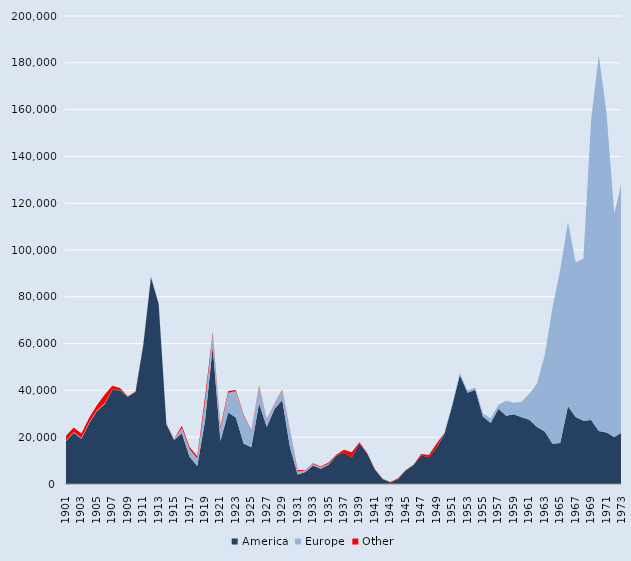
| Category | America | Europe | Other |
|---|---|---|---|
| 1901.0 | 18426 | 207 | 2013 |
| 1902.0 | 21916 | 290 | 1964 |
| 1903.0 | 19339 | 320 | 1952 |
| 1904.0 | 25963 | 379 | 1962 |
| 1905.0 | 31227 | 292 | 2091 |
| 1906.0 | 34094 | 369 | 3630 |
| 1907.0 | 40152 | 106 | 1692 |
| 1908.0 | 40046 | 83 | 866 |
| 1909.0 | 37295 | 67 | 89 |
| 1910.0 | 39359 | 48 | 268 |
| 1911.0 | 59150 | 253 | 146 |
| 1912.0 | 88383 | 329 | 122 |
| 1913.0 | 77015 | 407 | 3 |
| 1914.0 | 25576 | 114 | 40 |
| 1915.0 | 18830 | 390 | 94 |
| 1916.0 | 21662 | 2292 | 943 |
| 1917.0 | 11593 | 3381 | 851 |
| 1918.0 | 7663 | 3219 | 971 |
| 1919.0 | 26883 | 7989 | 2266 |
| 1920.0 | 58618 | 5008 | 1157 |
| 1921.0 | 18387 | 5167 | 1043 |
| 1922.0 | 30536 | 8488 | 771 |
| 1923.0 | 28395 | 11195 | 581 |
| 1924.0 | 17294 | 12003 | 413 |
| 1925.0 | 15697 | 6818 | 369 |
| 1926.0 | 34538 | 7087 | 442 |
| 1927.0 | 24375 | 3073 | 226 |
| 1928.0 | 32084 | 2013 | 200 |
| 1929.0 | 35898 | 4122 | 341 |
| 1930.0 | 15805 | 7014 | 377 |
| 1931.0 | 4055 | 1328 | 650 |
| 1932.0 | 5151 | 557 | 201 |
| 1933.0 | 7872 | 720 | 313 |
| 1934.0 | 6491 | 623 | 358 |
| 1935.0 | 8228 | 434 | 478 |
| 1936.0 | 12024 | 0 | 460 |
| 1937.0 | 13505 | 0 | 1162 |
| 1938.0 | 11290 | 0 | 2319 |
| 1939.0 | 17466 | 0 | 341 |
| 1940.0 | 13013 | 0 | 213 |
| 1941.0 | 6191 | 0 | 69 |
| 1942.0 | 2108 | 0 | 106 |
| 1943.0 | 660 | 0 | 233 |
| 1944.0 | 2168 | 0 | 256 |
| 1945.0 | 5728 | 0 | 210 |
| 1946.0 | 8123 | 0 | 152 |
| 1947.0 | 12128 | 0 | 710 |
| 1948.0 | 11474 | 0 | 869 |
| 1949.0 | 15647 | 0 | 1649 |
| 1950.0 | 21491 | 401 | 0 |
| 1951.0 | 33341 | 674 | 0 |
| 1952.0 | 46544 | 863 | 0 |
| 1953.0 | 39026 | 936 | 0 |
| 1954.0 | 40234 | 956 | 0 |
| 1955.0 | 28690 | 1457 | 0 |
| 1956.0 | 26072 | 2024 | 0 |
| 1957.0 | 32150 | 1744 | 0 |
| 1958.0 | 29207 | 6393 | 0 |
| 1959.0 | 29780 | 4974 | 0 |
| 1960.0 | 28513 | 6646 | 0 |
| 1961.0 | 27499 | 11073 | 0 |
| 1962.0 | 24376 | 18626 | 0 |
| 1963.0 | 22420 | 32798 | 0 |
| 1964.0 | 17232 | 58344 | 0 |
| 1965.0 | 17557 | 73931 | 0 |
| 1966.0 | 33266 | 78729 | 0 |
| 1967.0 | 28584 | 66128 | 0 |
| 1968.0 | 27014 | 69213 | 0 |
| 1969.0 | 27383 | 128289 | 0 |
| 1970.0 | 22659 | 160546 | 0 |
| 1971.0 | 21962 | 136511 | 0 |
| 1972.0 | 20122 | 95423 | 0 |
| 1973.0 | 22091 | 107641 | 0 |